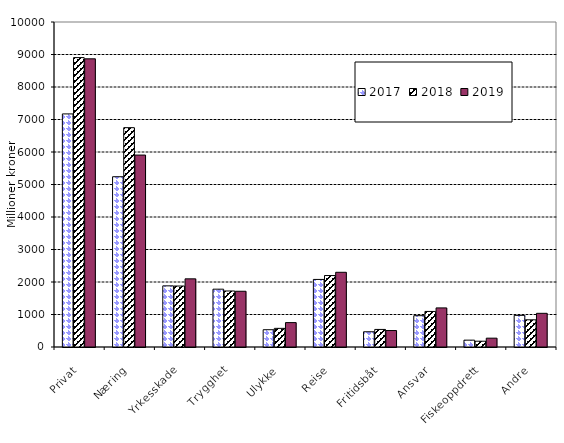
| Category | 2017 | 2018 | 2019 |
|---|---|---|---|
| Privat | 7171.79 | 8904.377 | 8866.897 |
| Næring | 5239.137 | 6748.858 | 5905.407 |
| Yrkesskade | 1881.452 | 1876.31 | 2097.287 |
| Trygghet | 1779.099 | 1723.739 | 1715.016 |
| Ulykke | 531.976 | 573.58 | 750.931 |
| Reise | 2078.892 | 2198.861 | 2298.928 |
| Fritidsbåt | 468.766 | 540.697 | 506.539 |
| Ansvar | 963.648 | 1093.968 | 1202.794 |
| Fiskeoppdrett | 211.046 | 178.362 | 271.743 |
| Andre | 973.926 | 836.59 | 1036.461 |